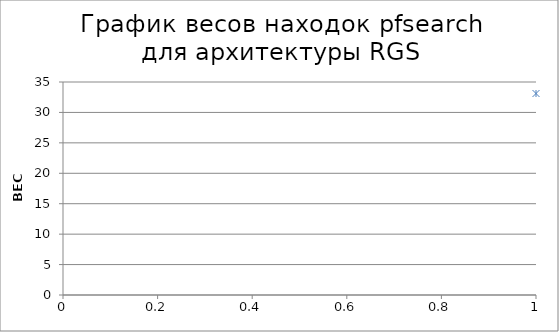
| Category | Series 0 |
|---|---|
| 0 | 33.11 |
| 1 | 32.95 |
| 2 | 32.74 |
| 3 | 32.5 |
| 4 | 32.4 |
| 5 | 32.32 |
| 6 | 32.27 |
| 7 | 32.26 |
| 8 | 31.63 |
| 9 | 31.31 |
| 10 | 31.11 |
| 11 | 30.89 |
| 12 | 30.83 |
| 13 | 30.12 |
| 14 | 29.43 |
| 15 | 29.04 |
| 16 | 28.91 |
| 17 | 28.72 |
| 18 | 28.64 |
| 19 | 28.51 |
| 20 | 27.59 |
| 21 | 8.52 |
| 22 | 8.39 |
| 23 | 7.74 |
| 24 | 7.68 |
| 25 | 7.57 |
| 26 | 7.21 |
| 27 | 6.63 |
| 28 | 6.63 |
| 29 | 3.68 |
| 30 | 3.06 |
| 31 | 2.97 |
| 32 | 2.77 |
| 33 | 2.77 |
| 34 | 2.76 |
| 35 | 2.51 |
| 36 | 2.43 |
| 37 | 2.24 |
| 38 | 2.21 |
| 39 | 2.05 |
| 40 | 1.61 |
| 41 | 1.19 |
| 42 | 1.18 |
| 43 | 1.09 |
| 44 | 0.95 |
| 45 | 0.92 |
| 46 | 0.78 |
| 47 | 0.75 |
| 48 | 0.75 |
| 49 | 0.68 |
| 50 | 0.67 |
| 51 | 0.66 |
| 52 | 0.6 |
| 53 | 0.58 |
| 54 | 0.58 |
| 55 | 0.55 |
| 56 | 0.53 |
| 57 | 0.52 |
| 58 | 0.52 |
| 59 | 0.5 |
| 60 | 0.46 |
| 61 | 0.46 |
| 62 | 0.45 |
| 63 | 0.43 |
| 64 | 0.41 |
| 65 | 0.38 |
| 66 | 0.34 |
| 67 | 0.32 |
| 68 | 0.32 |
| 69 | 0.3 |
| 70 | 0.3 |
| 71 | 0.25 |
| 72 | 0.25 |
| 73 | 0.25 |
| 74 | 0.23 |
| 75 | 0.2 |
| 76 | 0.18 |
| 77 | 0.18 |
| 78 | 0.17 |
| 79 | 0.17 |
| 80 | 0.17 |
| 81 | 0.17 |
| 82 | 0.17 |
| 83 | 0.17 |
| 84 | 0.17 |
| 85 | 0.16 |
| 86 | 0.15 |
| 87 | 0.14 |
| 88 | 0.14 |
| 89 | 0.14 |
| 90 | 0.13 |
| 91 | 0.12 |
| 92 | 0.09 |
| 93 | 0.09 |
| 94 | 0.09 |
| 95 | 0.05 |
| 96 | 0.04 |
| 97 | 0.04 |